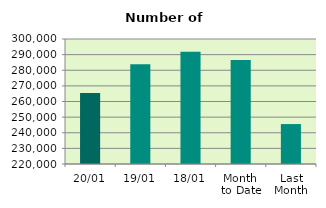
| Category | Series 0 |
|---|---|
| 20/01 | 265516 |
| 19/01 | 283790 |
| 18/01 | 291852 |
| Month 
to Date | 286498.8 |
| Last
Month | 245553.619 |